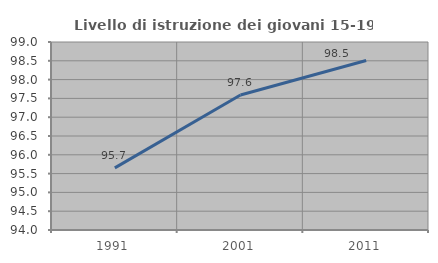
| Category | Livello di istruzione dei giovani 15-19 anni |
|---|---|
| 1991.0 | 95.652 |
| 2001.0 | 97.59 |
| 2011.0 | 98.507 |